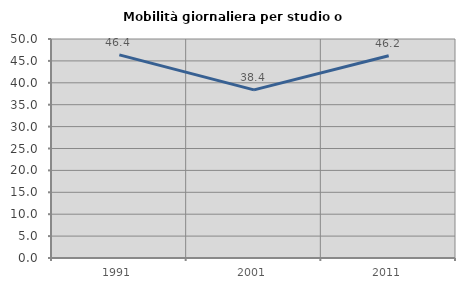
| Category | Mobilità giornaliera per studio o lavoro |
|---|---|
| 1991.0 | 46.38 |
| 2001.0 | 38.385 |
| 2011.0 | 46.177 |